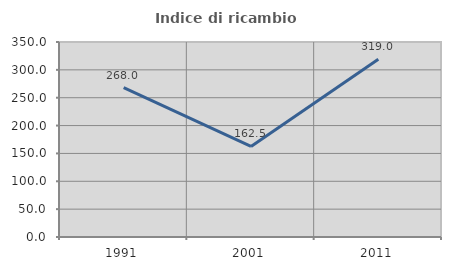
| Category | Indice di ricambio occupazionale  |
|---|---|
| 1991.0 | 268 |
| 2001.0 | 162.5 |
| 2011.0 | 319.048 |